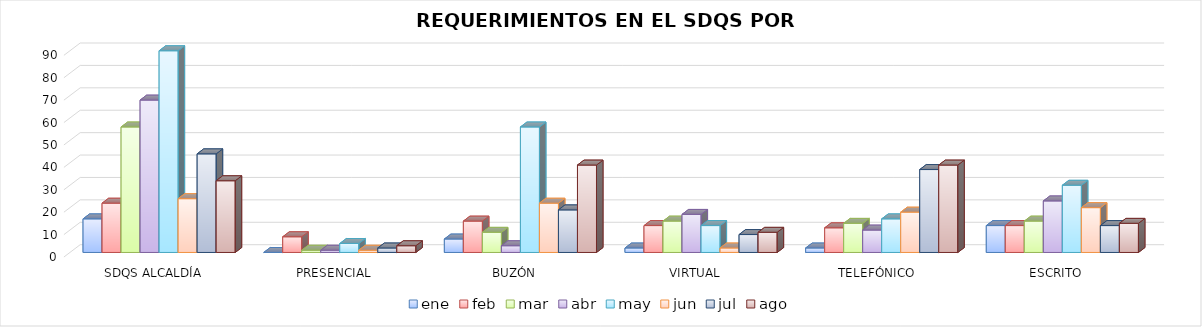
| Category | ene | feb | mar | abr | may | jun | jul | ago |
|---|---|---|---|---|---|---|---|---|
| SDQS ALCALDÍA | 15 | 22 | 56 | 68 | 90 | 24 | 44 | 32 |
| PRESENCIAL | 0 | 7 | 1 | 1 | 4 | 1 | 2 | 3 |
| BUZÓN | 6 | 14 | 9 | 3 | 56 | 22 | 19 | 39 |
| VIRTUAL | 2 | 12 | 14 | 17 | 12 | 2 | 8 | 9 |
| TELEFÓNICO | 2 | 11 | 13 | 10 | 15 | 18 | 37 | 39 |
| ESCRITO | 12 | 12 | 14 | 23 | 30 | 20 | 12 | 13 |